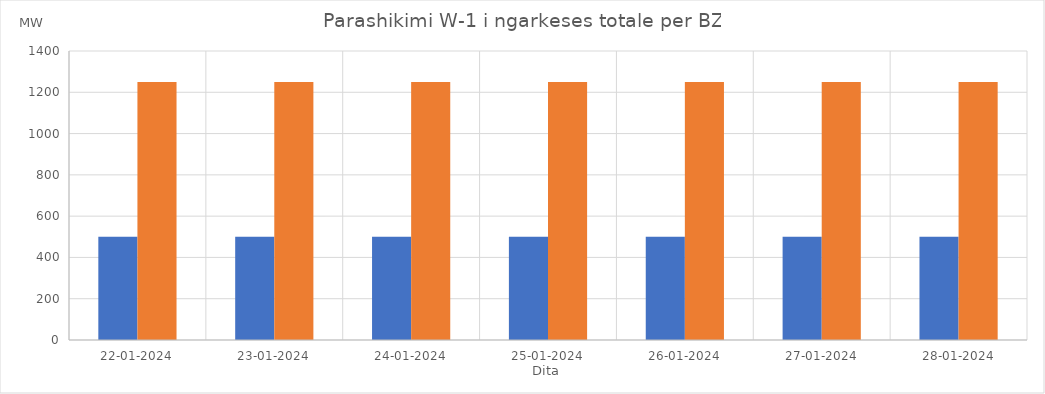
| Category | Min (MW) | Max (MW) |
|---|---|---|
| 22-01-2024 | 500 | 1250 |
| 23-01-2024 | 500 | 1250 |
| 24-01-2024 | 500 | 1250 |
| 25-01-2024 | 500 | 1250 |
| 26-01-2024 | 500 | 1250 |
| 27-01-2024 | 500 | 1250 |
| 28-01-2024 | 500 | 1250 |